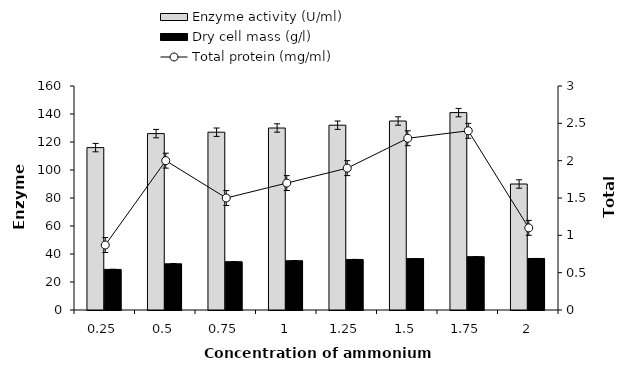
| Category | Enzyme activity (U/ml) | Dry cell mass (g/l) |
|---|---|---|
| 0.25 | 116 | 29 |
| 0.5 | 126 | 33 |
| 0.75 | 127 | 34.5 |
| 1.0 | 130 | 35.2 |
| 1.25 | 132 | 36.1 |
| 1.5 | 135 | 36.7 |
| 1.75 | 141 | 38.1 |
| 2.0 | 90 | 36.8 |